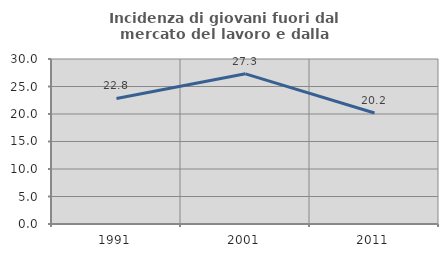
| Category | Incidenza di giovani fuori dal mercato del lavoro e dalla formazione  |
|---|---|
| 1991.0 | 22.835 |
| 2001.0 | 27.304 |
| 2011.0 | 20.192 |